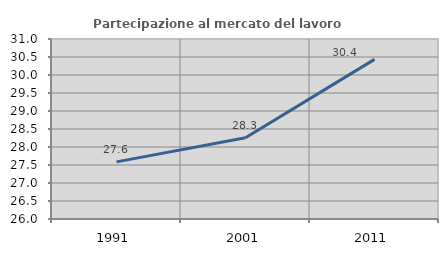
| Category | Partecipazione al mercato del lavoro  femminile |
|---|---|
| 1991.0 | 27.586 |
| 2001.0 | 28.256 |
| 2011.0 | 30.435 |